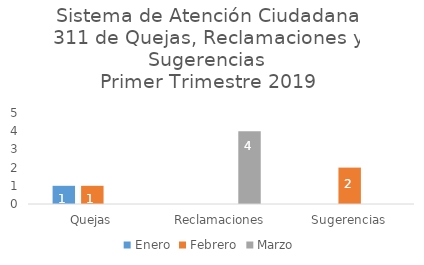
| Category | Enero | Febrero | Marzo |
|---|---|---|---|
| Quejas | 1 | 1 | 0 |
| Reclamaciones | 0 | 0 | 4 |
| Sugerencias | 0 | 2 | 0 |